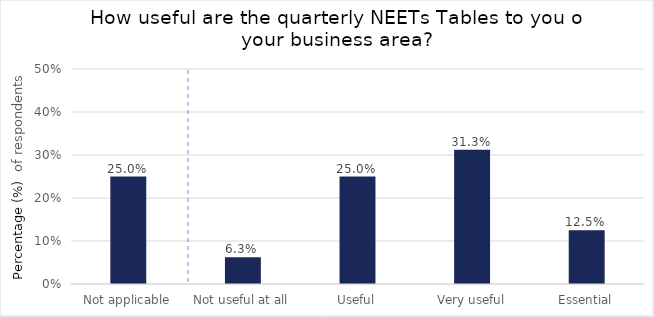
| Category | Not applicable |
|---|---|
| Not applicable | 0.25 |
| Not useful at all | 0.062 |
| Useful | 0.25 |
| Very useful | 0.312 |
| Essential | 0.125 |